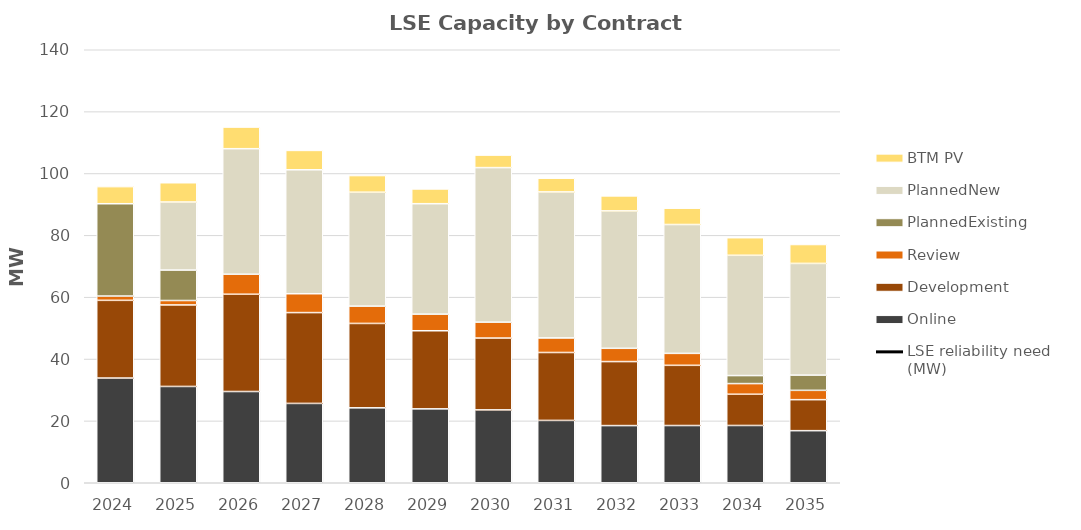
| Category | Online | Development | Review | PlannedExisting | PlannedNew | BTM PV |
|---|---|---|---|---|---|---|
| 2024.0 | 33.854 | 25.127 | 1.394 | 29.842 | 0 | 5.53 |
| 2025.0 | 31.14 | 26.351 | 1.433 | 9.845 | 22 | 6.231 |
| 2026.0 | 29.502 | 31.446 | 6.473 | 0 | 40.588 | 6.989 |
| 2027.0 | 25.652 | 29.368 | 6.098 | 0 | 40.077 | 6.258 |
| 2028.0 | 24.224 | 27.29 | 5.591 | 0 | 36.827 | 5.392 |
| 2029.0 | 23.893 | 25.257 | 5.364 | 0 | 35.71 | 4.768 |
| 2030.0 | 23.562 | 23.225 | 5.136 | 0 | 49.976 | 4.036 |
| 2031.0 | 20.157 | 21.96 | 4.713 | 0 | 47.204 | 4.434 |
| 2032.0 | 18.485 | 20.695 | 4.289 | 0 | 44.432 | 4.849 |
| 2033.0 | 18.502 | 19.467 | 3.865 | 0 | 41.661 | 5.267 |
| 2034.0 | 18.52 | 10.098 | 3.442 | 2.592 | 38.889 | 5.691 |
| 2035.0 | 16.843 | 10.021 | 3.018 | 4.915 | 36.118 | 6.114 |